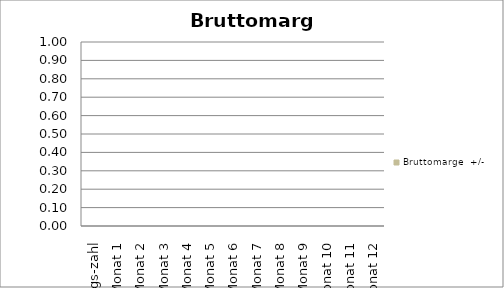
| Category | Bruttomarge |
|---|---|
| Anfangs-zahl | 0 |
| Monat 1 | 0 |
| Monat 2 | 0 |
| Monat 3 | 0 |
| Monat 4 | 0 |
| Monat 5 | 0 |
| Monat 6 | 0 |
| Monat 7 | 0 |
| Monat 8 | 0 |
| Monat 9 | 0 |
| Monat 10 | 0 |
| Monat 11 | 0 |
| Monat 12 | 0 |